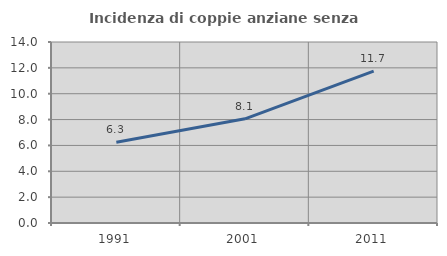
| Category | Incidenza di coppie anziane senza figli  |
|---|---|
| 1991.0 | 6.25 |
| 2001.0 | 8.057 |
| 2011.0 | 11.748 |